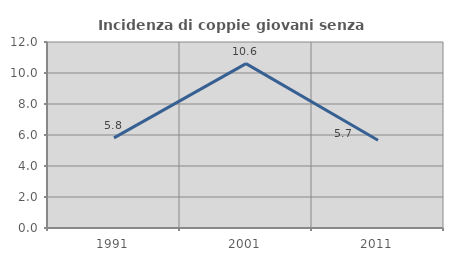
| Category | Incidenza di coppie giovani senza figli |
|---|---|
| 1991.0 | 5.814 |
| 2001.0 | 10.606 |
| 2011.0 | 5.66 |